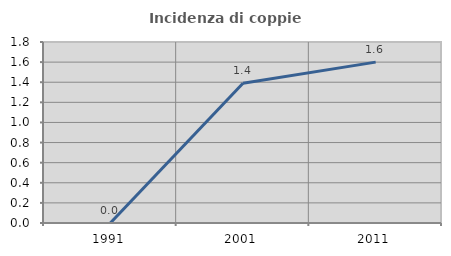
| Category | Incidenza di coppie miste |
|---|---|
| 1991.0 | 0 |
| 2001.0 | 1.389 |
| 2011.0 | 1.6 |